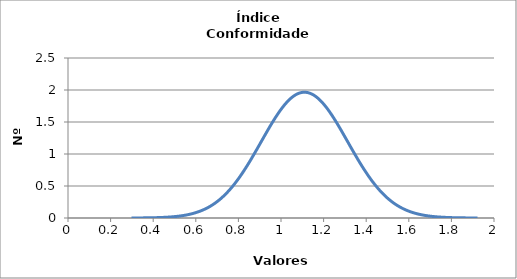
| Category | Series 0 |
|---|---|
| 0.2979206515265558 | 0.001 |
| 0.3143262949300597 | 0.001 |
| 0.3307319383335636 | 0.001 |
| 0.34713758173706755 | 0.002 |
| 0.36354322514057147 | 0.002 |
| 0.3799488685440754 | 0.003 |
| 0.3963545119475793 | 0.004 |
| 0.41276015535108324 | 0.005 |
| 0.42916579875458716 | 0.007 |
| 0.4455714421580911 | 0.009 |
| 0.461977085561595 | 0.012 |
| 0.4783827289650989 | 0.016 |
| 0.49478837236860285 | 0.02 |
| 0.5111940157721068 | 0.025 |
| 0.5275996591756107 | 0.032 |
| 0.5440053025791146 | 0.04 |
| 0.5604109459826185 | 0.05 |
| 0.5768165893861225 | 0.062 |
| 0.5932222327896264 | 0.077 |
| 0.6096278761931303 | 0.094 |
| 0.6260335195966342 | 0.115 |
| 0.6424391630001381 | 0.139 |
| 0.6588448064036421 | 0.166 |
| 0.675250449807146 | 0.198 |
| 0.6916560932106499 | 0.235 |
| 0.7080617366141538 | 0.277 |
| 0.7244673800176578 | 0.324 |
| 0.7408730234211617 | 0.376 |
| 0.7572786668246656 | 0.434 |
| 0.7736843102281695 | 0.498 |
| 0.7900899536316734 | 0.568 |
| 0.8064955970351774 | 0.643 |
| 0.8229012404386813 | 0.723 |
| 0.8393068838421852 | 0.808 |
| 0.8557125272456891 | 0.897 |
| 0.8721181706491931 | 0.989 |
| 0.888523814052697 | 1.084 |
| 0.9049294574562009 | 1.18 |
| 0.9213351008597048 | 1.276 |
| 0.9377407442632087 | 1.371 |
| 0.9541463876667127 | 1.464 |
| 0.9705520310702166 | 1.552 |
| 0.9869576744737205 | 1.635 |
| 1.0033633178772245 | 1.712 |
| 1.0197689612807286 | 1.78 |
| 1.0361746046842326 | 1.839 |
| 1.0525802480877366 | 1.888 |
| 1.0689858914912407 | 1.925 |
| 1.0853915348947447 | 1.951 |
| 1.1017971782982487 | 1.963 |
| 1.1182028217017528 | 1.963 |
| 1.1346084651052568 | 1.951 |
| 1.1510141085087608 | 1.925 |
| 1.1674197519122649 | 1.888 |
| 1.183825395315769 | 1.839 |
| 1.200231038719273 | 1.78 |
| 1.216636682122777 | 1.712 |
| 1.233042325526281 | 1.635 |
| 1.249447968929785 | 1.552 |
| 1.265853612333289 | 1.464 |
| 1.2822592557367931 | 1.371 |
| 1.2986648991402971 | 1.276 |
| 1.3150705425438012 | 1.18 |
| 1.3314761859473052 | 1.084 |
| 1.3478818293508092 | 0.989 |
| 1.3642874727543133 | 0.897 |
| 1.3806931161578173 | 0.808 |
| 1.3970987595613213 | 0.723 |
| 1.4135044029648254 | 0.643 |
| 1.4299100463683294 | 0.568 |
| 1.4463156897718334 | 0.498 |
| 1.4627213331753375 | 0.434 |
| 1.4791269765788415 | 0.376 |
| 1.4955326199823455 | 0.324 |
| 1.5119382633858496 | 0.277 |
| 1.5283439067893536 | 0.235 |
| 1.5447495501928576 | 0.198 |
| 1.5611551935963617 | 0.166 |
| 1.5775608369998657 | 0.139 |
| 1.5939664804033697 | 0.115 |
| 1.6103721238068738 | 0.094 |
| 1.6267777672103778 | 0.077 |
| 1.6431834106138818 | 0.062 |
| 1.6595890540173859 | 0.05 |
| 1.67599469742089 | 0.04 |
| 1.692400340824394 | 0.032 |
| 1.708805984227898 | 0.025 |
| 1.725211627631402 | 0.02 |
| 1.741617271034906 | 0.016 |
| 1.75802291443841 | 0.012 |
| 1.7744285578419141 | 0.009 |
| 1.7908342012454181 | 0.007 |
| 1.8072398446489222 | 0.005 |
| 1.8236454880524262 | 0.004 |
| 1.8400511314559302 | 0.003 |
| 1.8564567748594343 | 0.002 |
| 1.8728624182629383 | 0.002 |
| 1.8892680616664423 | 0.001 |
| 1.9056737050699464 | 0.001 |
| 1.9220793484734504 | 0.001 |